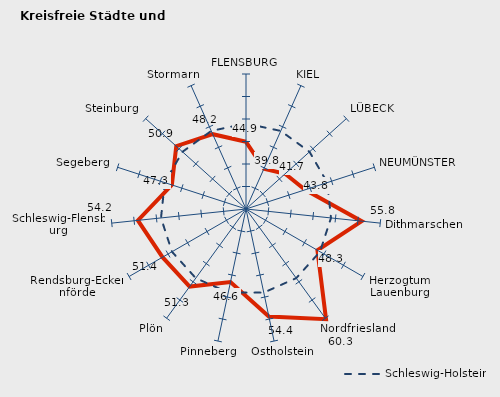
| Category | Kreise | Schleswig-Holstein |
|---|---|---|
| FLENSBURG | 44.936 | 48.992 |
| KIEL | 39.823 | 48.992 |
| LÜBECK | 41.703 | 48.992 |
| NEUMÜNSTER | 43.817 | 48.992 |
| Dithmarschen | 55.85 | 48.992 |
| Herzogtum Lauenburg | 48.326 | 48.992 |
| Nordfriesland | 60.253 | 48.992 |
| Ostholstein | 54.414 | 48.992 |
| Pinneberg | 46.614 | 48.992 |
| Plön | 51.308 | 48.992 |
| Rendsburg-Eckernförde | 51.425 | 48.992 |
| Schleswig-Flensburg | 54.155 | 48.992 |
| Segeberg | 47.318 | 48.992 |
| Steinburg | 50.858 | 48.992 |
| Stormarn | 48.198 | 48.992 |